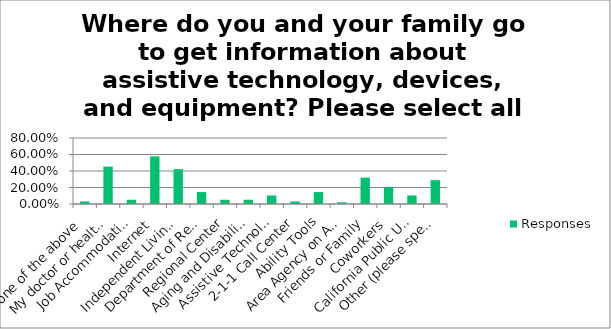
| Category | Responses |
|---|---|
| None of the above | 0.031 |
| My doctor or health care provider | 0.454 |
| Job Accommodation Network (JAN) | 0.052 |
| Internet | 0.577 |
| Independent Living Center | 0.423 |
| Department of Rehabilitation | 0.144 |
| Regional Center | 0.052 |
| Aging and Disability Resource Connection | 0.052 |
| Assistive Technology Center | 0.103 |
| 2-1-1 Call Center | 0.031 |
| Ability Tools | 0.144 |
| Area Agency on Aging | 0.021 |
| Friends or Family | 0.32 |
| Coworkers | 0.206 |
| California Public Utilities Commission | 0.103 |
| Other (please specify) | 0.289 |